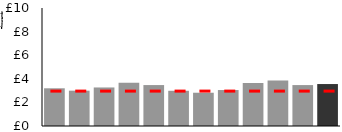
| Category | Costs (£) |
|---|---|
| Jan | 3195.84 |
| Feb | 2995.365 |
| Mar | 3264.96 |
| April | 3668.88 |
| May | 3468.72 |
| Jun | 2984.723 |
| Jul | 2818.891 |
| Aug | 3046.958 |
| Sep | 3654.109 |
| Oct | 3856.321 |
| Nov | 3468 |
| Dec | 3555.491 |